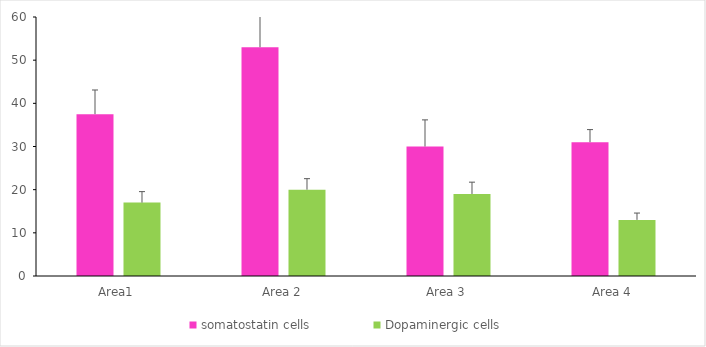
| Category | somatostatin cells | Dopaminergic cells |
|---|---|---|
| Area1 | 37.5 | 17 |
| Area 2 | 53 | 20 |
| Area 3 | 30 | 19 |
| Area 4 | 31 | 13 |